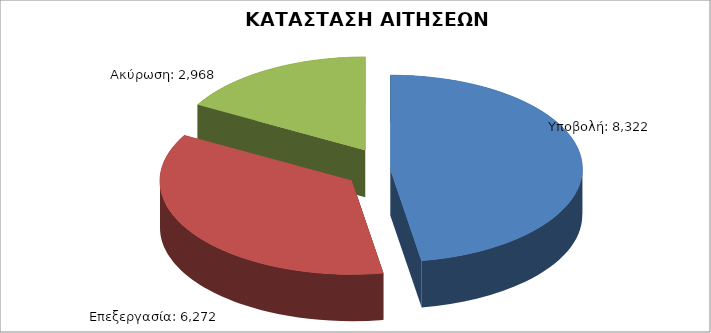
| Category | Series 0 |
|---|---|
| Υποβολή: | 8322 |
| Επεξεργασία: | 6272 |
| Ακύρωση: | 2968 |